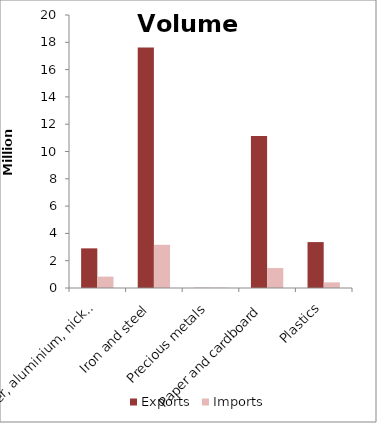
| Category | Exports | Imports |
|---|---|---|
| Copper, aluminium, nickel | 2.904 | 0.832 |
| Iron and steel | 17.62 | 3.167 |
| Precious metals | 0.011 | 0.02 |
| Paper and cardboard | 11.135 | 1.461 |
| Plastics | 3.364 | 0.41 |